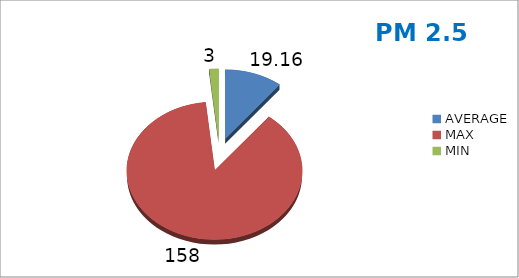
| Category | Series 0 |
|---|---|
| AVERAGE | 19.163 |
| MAX | 158 |
| MIN | 3 |